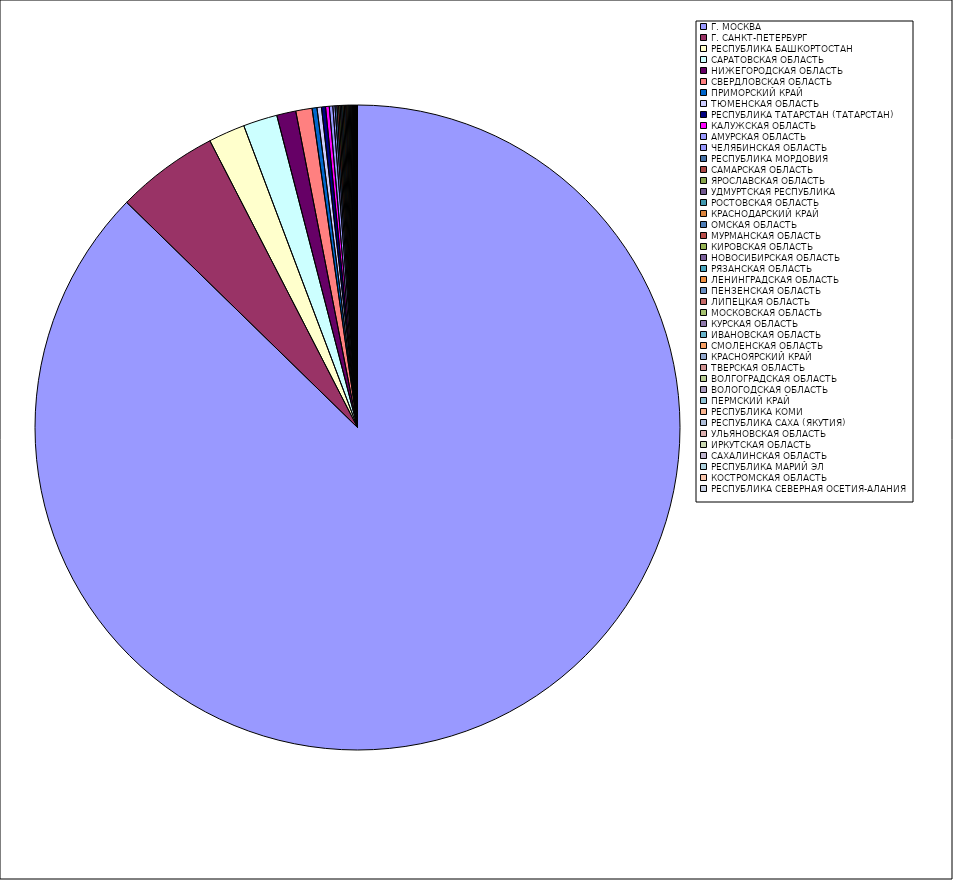
| Category | Оборот |
|---|---|
| Г. МОСКВА | 87.266 |
| Г. САНКТ-ПЕТЕРБУРГ | 5.131 |
| РЕСПУБЛИКА БАШКОРТОСТАН | 1.831 |
| САРАТОВСКАЯ ОБЛАСТЬ | 1.706 |
| НИЖЕГОРОДСКАЯ ОБЛАСТЬ | 0.959 |
| СВЕРДЛОВСКАЯ ОБЛАСТЬ | 0.816 |
| ПРИМОРСКИЙ КРАЙ | 0.244 |
| ТЮМЕНСКАЯ ОБЛАСТЬ | 0.224 |
| РЕСПУБЛИКА ТАТАРСТАН (ТАТАРСТАН) | 0.201 |
| КАЛУЖСКАЯ ОБЛАСТЬ | 0.186 |
| АМУРСКАЯ ОБЛАСТЬ | 0.176 |
| ЧЕЛЯБИНСКАЯ ОБЛАСТЬ | 0.108 |
| РЕСПУБЛИКА МОРДОВИЯ | 0.095 |
| САМАРСКАЯ ОБЛАСТЬ | 0.086 |
| ЯРОСЛАВСКАЯ ОБЛАСТЬ | 0.073 |
| УДМУРТСКАЯ РЕСПУБЛИКА | 0.07 |
| РОСТОВСКАЯ ОБЛАСТЬ | 0.068 |
| КРАСНОДАРСКИЙ КРАЙ | 0.068 |
| ОМСКАЯ ОБЛАСТЬ | 0.066 |
| МУРМАНСКАЯ ОБЛАСТЬ | 0.059 |
| КИРОВСКАЯ ОБЛАСТЬ | 0.059 |
| НОВОСИБИРСКАЯ ОБЛАСТЬ | 0.055 |
| РЯЗАНСКАЯ ОБЛАСТЬ | 0.05 |
| ЛЕНИНГРАДСКАЯ ОБЛАСТЬ | 0.046 |
| ПЕНЗЕНСКАЯ ОБЛАСТЬ | 0.044 |
| ЛИПЕЦКАЯ ОБЛАСТЬ | 0.034 |
| МОСКОВСКАЯ ОБЛАСТЬ | 0.028 |
| КУРСКАЯ ОБЛАСТЬ | 0.028 |
| ИВАНОВСКАЯ ОБЛАСТЬ | 0.023 |
| СМОЛЕНСКАЯ ОБЛАСТЬ | 0.022 |
| КРАСНОЯРСКИЙ КРАЙ | 0.019 |
| ТВЕРСКАЯ ОБЛАСТЬ | 0.017 |
| ВОЛГОГРАДСКАЯ ОБЛАСТЬ | 0.016 |
| ВОЛОГОДСКАЯ ОБЛАСТЬ | 0.014 |
| ПЕРМСКИЙ КРАЙ | 0.01 |
| РЕСПУБЛИКА КОМИ | 0.01 |
| РЕСПУБЛИКА САХА (ЯКУТИЯ) | 0.01 |
| УЛЬЯНОВСКАЯ ОБЛАСТЬ | 0.008 |
| ИРКУТСКАЯ ОБЛАСТЬ | 0.007 |
| САХАЛИНСКАЯ ОБЛАСТЬ | 0.007 |
| РЕСПУБЛИКА МАРИЙ ЭЛ | 0.007 |
| КОСТРОМСКАЯ ОБЛАСТЬ | 0.006 |
| РЕСПУБЛИКА СЕВЕРНАЯ ОСЕТИЯ-АЛАНИЯ | 0.006 |